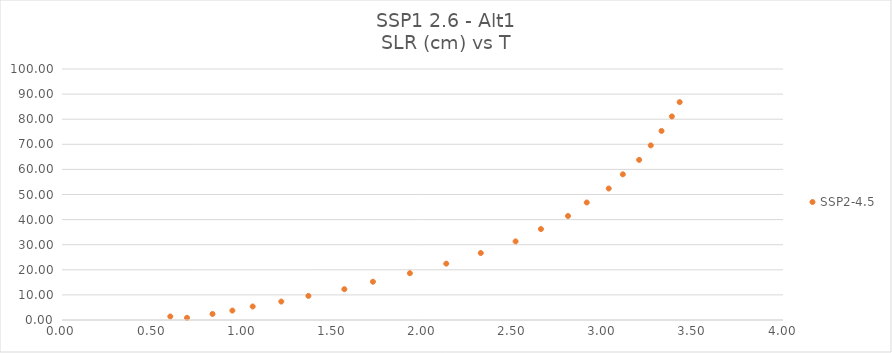
| Category | SSP2-4.5 |
|---|---|
| 0.693400617 | 0.87 |
| 0.600872844 | 1.399 |
| 0.835003234 | 2.407 |
| 0.945258389 | 3.755 |
| 1.057970477 | 5.386 |
| 1.216609042 | 7.344 |
| 1.366998793 | 9.606 |
| 1.566434093 | 12.264 |
| 1.725137117 | 15.242 |
| 1.930069364 | 18.639 |
| 2.131910838 | 22.459 |
| 2.323506779 | 26.684 |
| 2.516505038 | 31.32 |
| 2.657159805 | 36.233 |
| 2.807257579 | 41.441 |
| 2.911235411 | 46.813 |
| 3.033186146 | 52.388 |
| 3.111415519 | 58.038 |
| 3.201862444 | 63.788 |
| 3.266298087 | 69.558 |
| 3.326103087 | 75.33 |
| 3.383455107 | 81.093 |
| 3.426742442 | 86.804 |